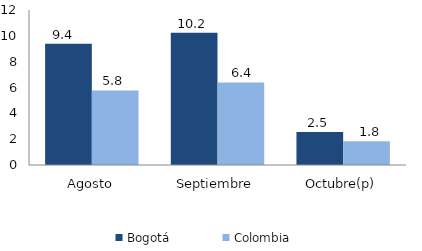
| Category | Bogotá | Colombia |
|---|---|---|
| Agosto | 9.391 | 5.776 |
| Septiembre | 10.232 | 6.393 |
| Octubre(p) | 2.547 | 1.834 |